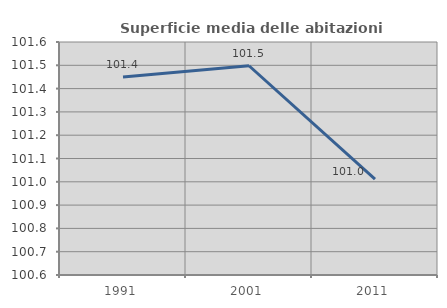
| Category | Superficie media delle abitazioni occupate |
|---|---|
| 1991.0 | 101.45 |
| 2001.0 | 101.498 |
| 2011.0 | 101.012 |